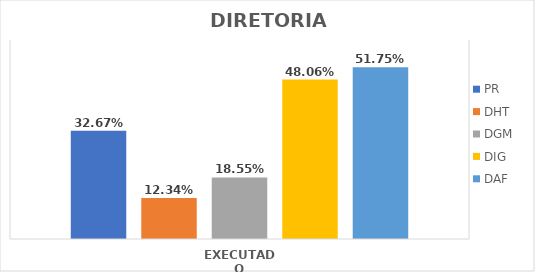
| Category | PR | DHT | DGM | DIG | DAF |
|---|---|---|---|---|---|
| EXECUTADO | 0.327 | 0.123 | 0.186 | 0.481 | 0.517 |